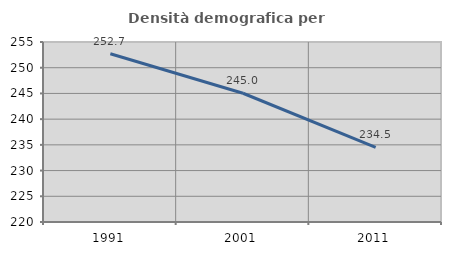
| Category | Densità demografica |
|---|---|
| 1991.0 | 252.706 |
| 2001.0 | 245.034 |
| 2011.0 | 234.528 |